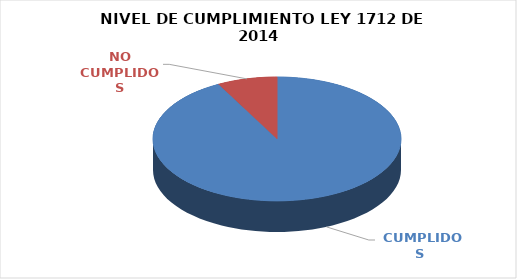
| Category | Series 0 |
|---|---|
|  CUMPLIDOS | 106 |
| NO CUMPLIDOS | 9 |